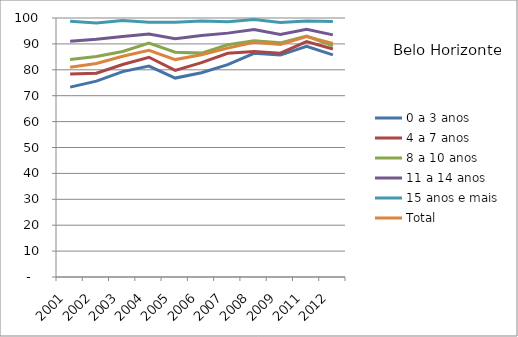
| Category | 0 a 3 anos | 4 a 7 anos | 8 a 10 anos | 11 a 14 anos | 15 anos e mais | Total |
|---|---|---|---|---|---|---|
| 2001.0 | 73.31 | 78.34 | 83.95 | 91.06 | 98.74 | 80.99 |
| 2002.0 | 75.62 | 78.65 | 85.14 | 91.78 | 98.1 | 82.46 |
| 2003.0 | 79.31 | 82.03 | 87.07 | 92.85 | 98.99 | 85.22 |
| 2004.0 | 81.43 | 84.85 | 90.32 | 93.82 | 98.35 | 87.5 |
| 2005.0 | 76.8 | 79.75 | 86.82 | 91.98 | 98.37 | 83.94 |
| 2006.0 | 78.88 | 82.76 | 86.44 | 93.23 | 98.83 | 85.79 |
| 2007.0 | 82 | 86.37 | 89.66 | 94.16 | 98.53 | 88.36 |
| 2008.0 | 86.35 | 87.1 | 91.22 | 95.58 | 99.39 | 90.59 |
| 2009.0 | 85.68 | 86.43 | 90.4 | 93.65 | 98.29 | 89.73 |
| 2011.0 | 89.08 | 90.88 | 93.06 | 95.65 | 98.8 | 92.8 |
| 2012.0 | 85.75 | 88.04 | 89.23 | 93.48 | 98.66 | 90.19 |